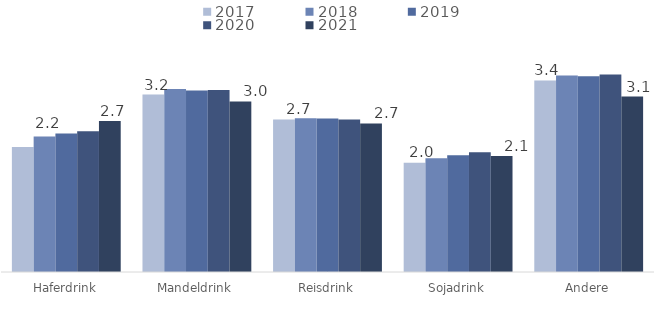
| Category | 2017 | 2018 | 2019 | 2020 | 2021 |
|---|---|---|---|---|---|
| Haferdrink | 2.234 | 2.419 | 2.471 | 2.515 | 2.696 |
| Mandeldrink | 3.168 | 3.27 | 3.241 | 3.249 | 3.045 |
| Reisdrink | 2.724 | 2.747 | 2.741 | 2.723 | 2.653 |
| Sojadrink | 1.952 | 2.03 | 2.085 | 2.138 | 2.071 |
| Andere | 3.42 | 3.509 | 3.498 | 3.526 | 3.133 |